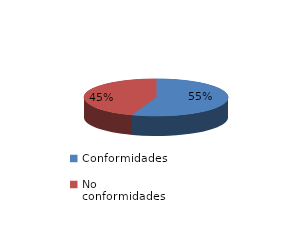
| Category | Series 0 |
|---|---|
| Conformidades | 2521 |
| No conformidades | 2032 |